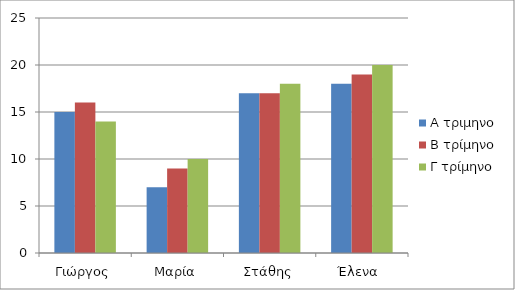
| Category | Α τριμηνο | Β τρίμηνο | Γ τρίμηνο |
|---|---|---|---|
| Γιώργος | 15 | 16 | 14 |
| Μαρία | 7 | 9 | 10 |
| Στάθης | 17 | 17 | 18 |
| Έλενα  | 18 | 19 | 20 |